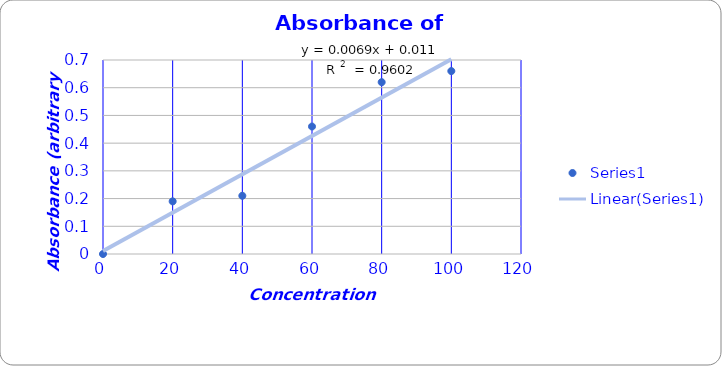
| Category | Series 0 |
|---|---|
| 0.0 | 0 |
| 20.0 | 0.19 |
| 40.0 | 0.21 |
| 60.0 | 0.46 |
| 80.0 | 0.62 |
| 100.0 | 0.66 |